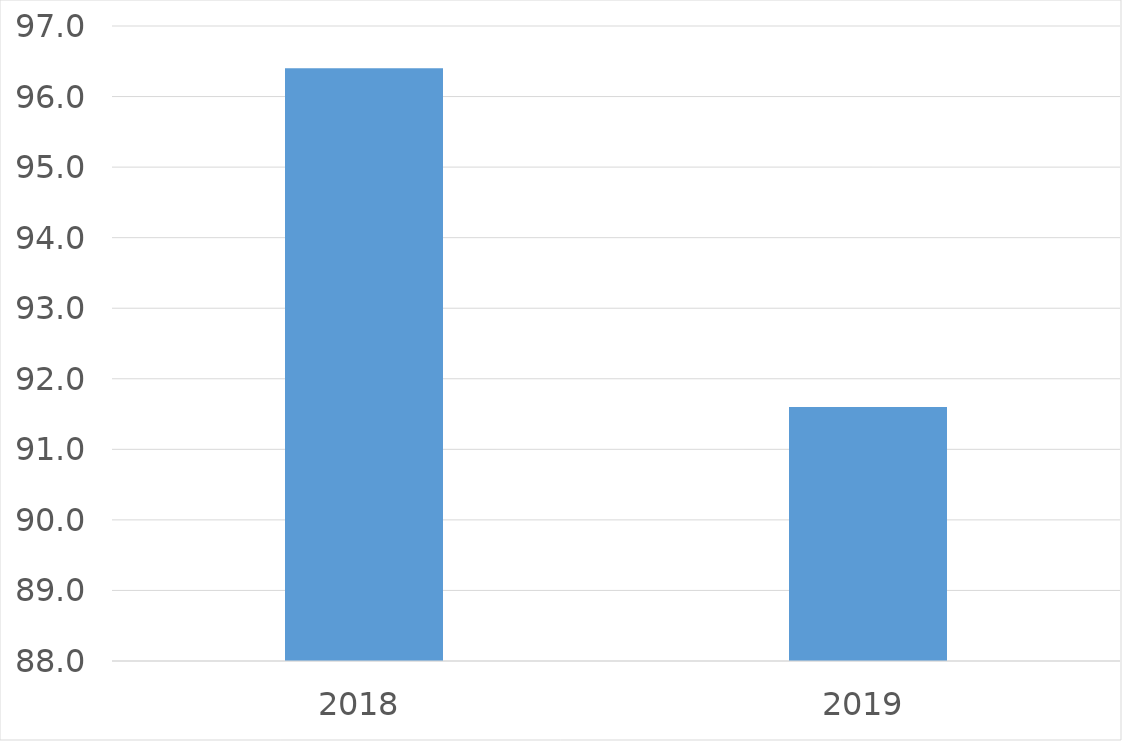
| Category | Series 0 |
|---|---|
| 2018 | 96.4 |
| 2019 | 91.6 |